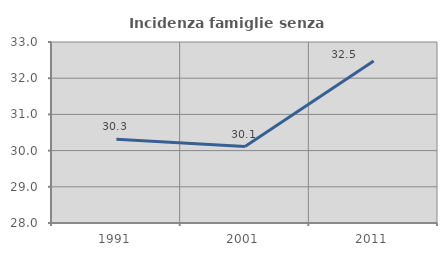
| Category | Incidenza famiglie senza nuclei |
|---|---|
| 1991.0 | 30.316 |
| 2001.0 | 30.11 |
| 2011.0 | 32.472 |